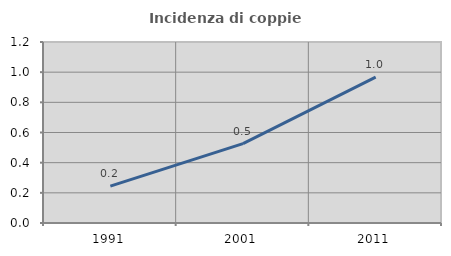
| Category | Incidenza di coppie miste |
|---|---|
| 1991.0 | 0.245 |
| 2001.0 | 0.527 |
| 2011.0 | 0.967 |